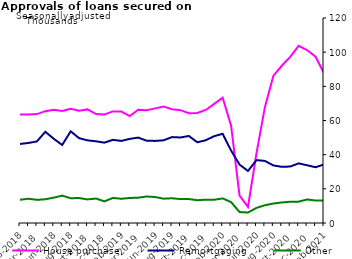
| Category | House purchase | Remortgaging | Other |
|---|---|---|---|
| Feb-2018 | 63539 | 46268 | 13599 |
| Mar-2018 | 63510 | 46857 | 14201 |
| Apr-2018 | 63763 | 47735 | 13564 |
| May-2018 | 65481 | 53394 | 13873 |
| Jun-2018 | 66222 | 49301 | 14850 |
| Jul-2018 | 65630 | 45660 | 16023 |
| Aug-2018 | 66881 | 53680 | 14513 |
| Sep-2018 | 65734 | 49647 | 14610 |
| Oct-2018 | 66491 | 48377 | 13803 |
| Nov-2018 | 63761 | 47829 | 14333 |
| Dec-2018 | 63491 | 47030 | 12654 |
| Jan-2019 | 65309 | 48686 | 14675 |
| Feb-2019 | 65208 | 48050 | 14194 |
| Mar-2019 | 62609 | 49240 | 14646 |
| Apr-2019 | 66352 | 49991 | 14821 |
| May-2019 | 66073 | 48159 | 15507 |
| Jun-2019 | 67092 | 48053 | 15214 |
| Jul-2019 | 68140 | 48398 | 14237 |
| Aug-2019 | 66545 | 50289 | 14478 |
| Sep-2019 | 66053 | 50063 | 14018 |
| Oct-2019 | 64260 | 50937 | 14011 |
| Nov-2019 | 64357 | 47253 | 13337 |
| Dec-2019 | 66179 | 48467 | 13647 |
| Jan-2020 | 69765 | 50819 | 13616 |
| Feb-2020 | 73382 | 52214 | 14387 |
| Mar-2020 | 56929 | 42389 | 12219 |
| Apr-2020 | 16096 | 34194 | 6397 |
| May-2020 | 9432 | 30452 | 6149 |
| Jun-2020 | 40681 | 36800 | 8821 |
| Jul-2020 | 67811 | 36347 | 10415 |
| Aug-2020 | 86085 | 33720 | 11402 |
| Sep-2020 | 92045 | 32887 | 12019 |
| Oct-2020 | 97264 | 33049 | 12457 |
| Nov-2020 | 103708 | 34895 | 12497 |
| Dec-2020 | 101252 | 33799 | 13773 |
| Jan-2021 | 97350 | 32634 | 13164 |
| Feb-2021 | 87669 | 34292 | 13084 |